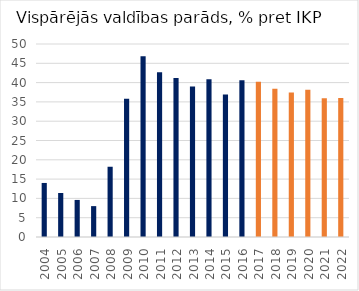
| Category | Latvia |
|---|---|
| 2004 | 14 |
| 2005 | 11.4 |
| 2006 | 9.6 |
| 2007 | 8 |
| 2008 | 18.2 |
| 2009 | 35.8 |
| 2010 | 46.8 |
| 2011 | 42.7 |
| 2012 | 41.2 |
| 2013 | 39 |
| 2014 | 40.9 |
| 2015 | 36.9 |
| 2016 | 40.6 |
| 2017 | 40.2 |
| 2018 | 38.4 |
| 2019 | 37.405 |
| 2020 | 38.153 |
| 2021 | 35.944 |
| 2022 | 36.005 |